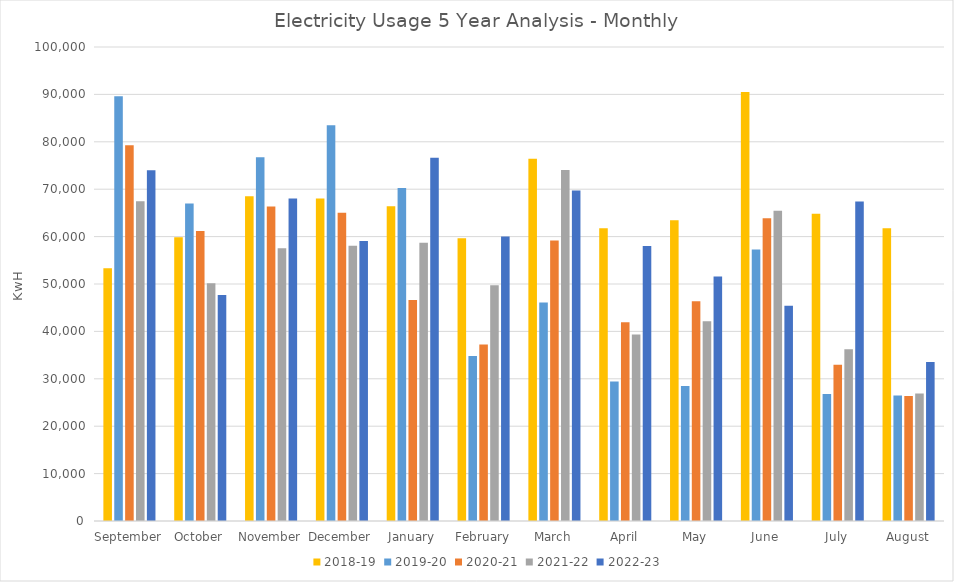
| Category | 2018-19 | 2019-20 | 2020-21 | 2021-22 | 2022-23 |
|---|---|---|---|---|---|
| September  | 53331 | 89618 | 79290 | 67458 | 74013 |
| October | 59869 | 67005 | 61201 | 50166 | 47656 |
| November | 68521 | 76739 | 66344 | 57556 | 68059 |
| December | 68020 | 83475 | 65058 | 58095 | 59065 |
| January | 66424 | 70277 | 46641 | 58721 | 76617 |
| February | 59633 | 34836 | 37226 | 49749 | 60035 |
| March | 76427 | 46114 | 59165 | 74035 | 69711 |
| April | 61783 | 29444 | 41907 | 39343 | 58006 |
| May | 63444 | 28467 | 46351 | 42124 | 51602 |
| June | 90513 | 57277 | 63897 | 65466 | 45425 |
| July | 64829 | 26770 | 32955 | 36233 | 67430 |
| August | 61764 | 26496 | 26358 | 26895 | 33533 |